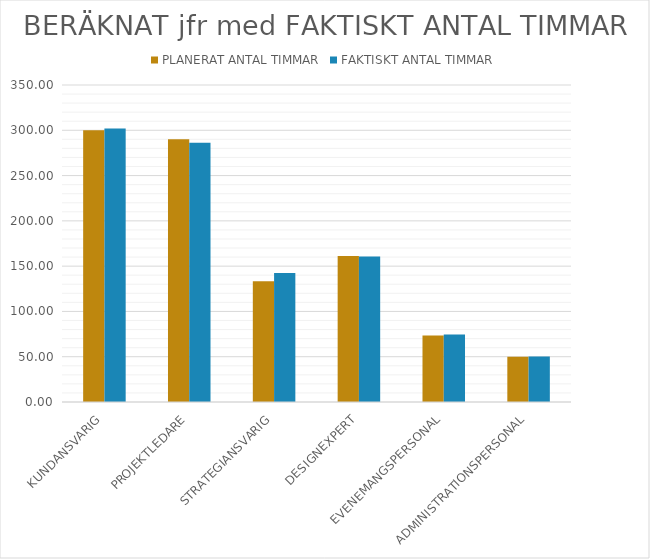
| Category | PLANERAT ANTAL TIMMAR | FAKTISKT ANTAL TIMMAR |
|---|---|---|
| KUNDANSVARIG | 300 | 302 |
| PROJEKTLEDARE | 290 | 286.333 |
| STRATEGIANSVARIG | 133.333 | 142.5 |
| DESIGNEXPERT | 161.111 | 160.556 |
| EVENEMANGSPERSONAL | 73.333 | 74.444 |
| ADMINISTRATIONSPERSONAL | 50 | 50.333 |